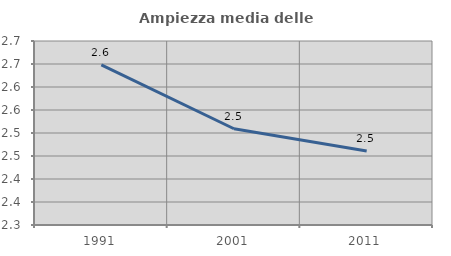
| Category | Ampiezza media delle famiglie |
|---|---|
| 1991.0 | 2.648 |
| 2001.0 | 2.509 |
| 2011.0 | 2.461 |